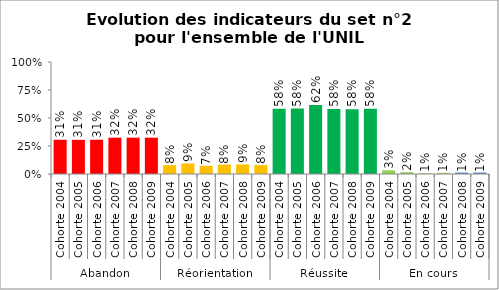
| Category | Ensemble UNIL |
|---|---|
| 0 | 0.306 |
| 1 | 0.305 |
| 2 | 0.306 |
| 3 | 0.324 |
| 4 | 0.325 |
| 5 | 0.324 |
| 6 | 0.079 |
| 7 | 0.094 |
| 8 | 0.073 |
| 9 | 0.084 |
| 10 | 0.085 |
| 11 | 0.08 |
| 12 | 0.582 |
| 13 | 0.585 |
| 14 | 0.615 |
| 15 | 0.581 |
| 16 | 0.578 |
| 17 | 0.583 |
| 18 | 0.033 |
| 19 | 0.016 |
| 20 | 0.005 |
| 21 | 0.01 |
| 22 | 0.013 |
| 23 | 0.013 |